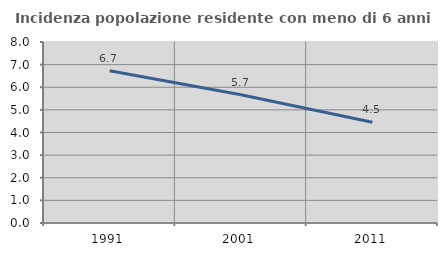
| Category | Incidenza popolazione residente con meno di 6 anni |
|---|---|
| 1991.0 | 6.733 |
| 2001.0 | 5.669 |
| 2011.0 | 4.455 |